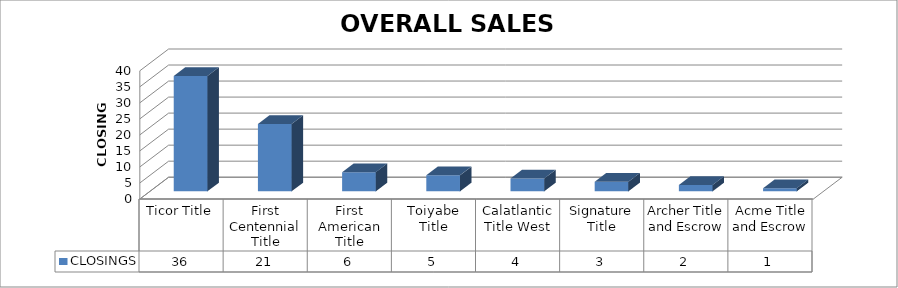
| Category | CLOSINGS |
|---|---|
| Ticor Title | 36 |
| First Centennial Title | 21 |
| First American Title | 6 |
| Toiyabe Title | 5 |
| Calatlantic Title West | 4 |
| Signature Title | 3 |
| Archer Title and Escrow | 2 |
| Acme Title and Escrow | 1 |